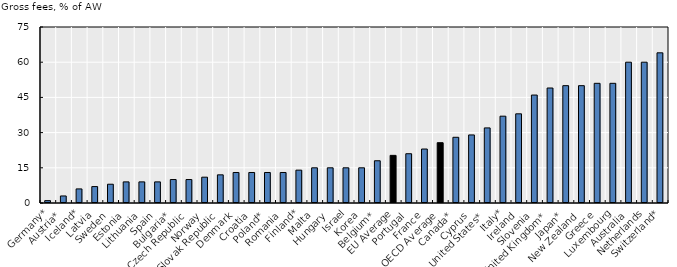
| Category | Childcare fee |
|---|---|
| Germany* | 1 |
| Austria* | 3 |
| Iceland* | 6 |
| Latvia | 7 |
| Sweden | 8 |
| Estonia | 9 |
| Lithuania | 9 |
| Spain | 9 |
| Bulgaria* | 10 |
| Czech Republic | 10 |
| Norway | 11 |
| Slovak Republic | 12 |
| Denmark | 13 |
| Croatia | 13 |
| Poland* | 13 |
| Romania | 13 |
| Finland* | 14 |
| Malta | 15 |
| Hungary | 15 |
| Israel | 15 |
| Korea | 15 |
| Belgium* | 18 |
| EU Average | 20.296 |
| Portugal | 21 |
| France | 23 |
| OECD Average | 25.697 |
| Canada* | 28 |
| Cyprus | 29 |
| United States* | 32 |
| Italy* | 37 |
| Ireland | 38 |
| Slovenia | 46 |
| United Kingdom* | 49 |
| Japan* | 50 |
| New Zealand | 50 |
| Greece | 51 |
| Luxembourg | 51 |
| Australia | 60 |
| Netherlands | 60 |
| Switzerland* | 64 |